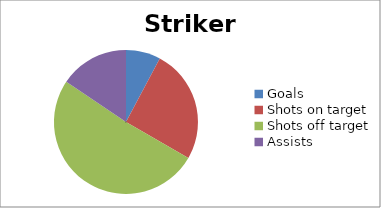
| Category | Striker 1 |
|---|---|
| Goals | 7 |
| Shots on target | 23 |
| Shots off target | 46 |
| Assists | 14 |